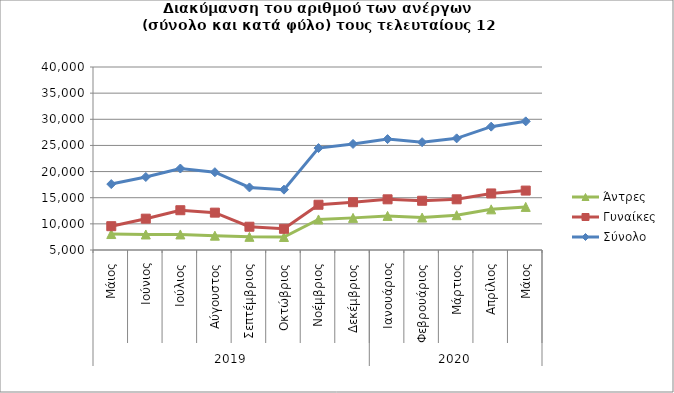
| Category | Άντρες | Γυναίκες | Σύνολο |
|---|---|---|---|
| 0 | 8053 | 9554 | 17607 |
| 1 | 7968 | 10992 | 18960 |
| 2 | 7975 | 12607 | 20582 |
| 3 | 7739 | 12144 | 19883 |
| 4 | 7518 | 9450 | 16968 |
| 5 | 7491 | 9053 | 16544 |
| 6 | 10842 | 13653 | 24495 |
| 7 | 11144 | 14141 | 25285 |
| 8 | 11522 | 14692 | 26214 |
| 9 | 11203 | 14417 | 25620 |
| 10 | 11658 | 14695 | 26353 |
| 11 | 12774 | 15817 | 28591 |
| 12 | 13242 | 16362 | 29604 |